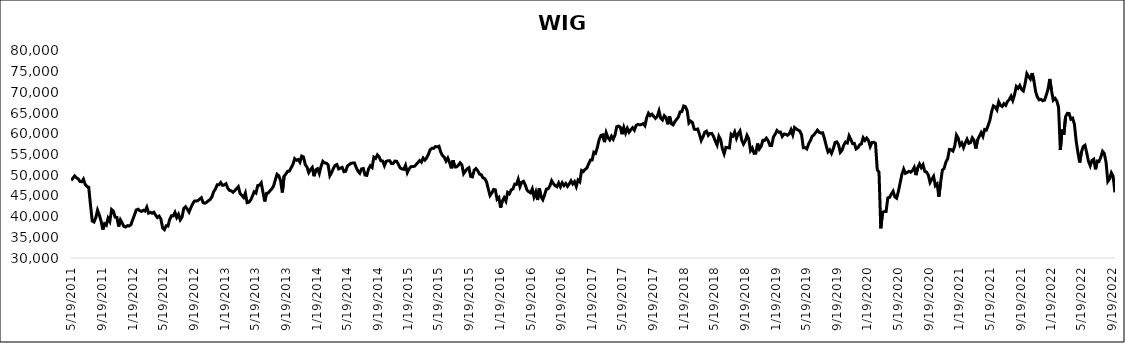
| Category | WIG |
|---|---|
| 5/19/11 | 48747.55 |
| 6/2/11 | 49824.93 |
| 6/9/11 | 49378.82 |
| 6/16/11 | 49129.21 |
| 6/23/11 | 48485.26 |
| 6/30/11 | 48414.36 |
| 7/7/11 | 49057.05 |
| 7/14/11 | 47768.38 |
| 7/21/11 | 47291.31 |
| 7/28/11 | 47071.4 |
| 8/4/11 | 42828.22 |
| 8/11/11 | 38934.71 |
| 8/18/11 | 38697.56 |
| 8/25/11 | 39715.27 |
| 9/1/11 | 41553.09 |
| 9/8/11 | 40405.17 |
| 9/15/11 | 38945 |
| 9/22/11 | 36851.2 |
| 9/29/11 | 38264.32 |
| 10/6/11 | 37915.03 |
| 10/13/11 | 39608.13 |
| 10/20/11 | 38835.92 |
| 10/27/11 | 41708.88 |
| 11/3/11 | 41313.92 |
| 11/10/11 | 39853.18 |
| 11/17/11 | 39797.19 |
| 11/24/11 | 37607.27 |
| 12/1/11 | 39215.21 |
| 12/8/11 | 38474.28 |
| 12/15/11 | 37637.47 |
| 12/22/11 | 37478.7 |
| 12/29/11 | 37814.52 |
| 1/5/12 | 37739.39 |
| 1/12/12 | 38062.87 |
| 1/19/12 | 39288.13 |
| 1/26/12 | 40392.48 |
| 2/2/12 | 41602.24 |
| 2/9/12 | 41792.46 |
| 2/16/12 | 41430.3 |
| 2/23/12 | 41258.14 |
| 3/1/12 | 41533.87 |
| 3/8/12 | 41337.97 |
| 3/15/12 | 42281.33 |
| 3/22/12 | 40834.43 |
| 3/29/12 | 41028.06 |
| 4/5/12 | 40802.41 |
| 4/12/12 | 41053.82 |
| 4/19/12 | 40354.53 |
| 4/26/12 | 39761.78 |
| 5/3/12 | 40114.73 |
| 5/10/12 | 39404.16 |
| 5/17/12 | 37228.88 |
| 5/24/12 | 36852.75 |
| 5/31/12 | 37793.58 |
| 6/7/12 | 37707.25 |
| 6/14/12 | 39286.64 |
| 6/21/12 | 40207.61 |
| 6/28/12 | 40165.34 |
| 7/5/12 | 41013.96 |
| 7/12/12 | 39778.1 |
| 7/19/12 | 40545.64 |
| 7/26/12 | 39213.05 |
| 8/2/12 | 39876.95 |
| 8/9/12 | 41976.63 |
| 8/16/12 | 42408.41 |
| 8/23/12 | 41795.63 |
| 8/30/12 | 41077.44 |
| 9/6/12 | 42134.93 |
| 9/13/12 | 43047.41 |
| 9/20/12 | 43737.02 |
| 9/27/12 | 43763.3 |
| 10/4/12 | 43840.23 |
| 10/11/12 | 44224.67 |
| 10/18/12 | 44550.12 |
| 10/25/12 | 43374.6 |
| 11/1/12 | 43232.44 |
| 11/8/12 | 43429.42 |
| 11/15/12 | 43845.94 |
| 11/22/12 | 44121.53 |
| 11/29/12 | 44787.84 |
| 12/6/12 | 46019.97 |
| 12/13/12 | 46653.84 |
| 12/20/12 | 47701.82 |
| 12/27/12 | 47673.03 |
| 1/3/13 | 48222.72 |
| 1/10/13 | 47546.91 |
| 1/17/13 | 47661.37 |
| 1/24/13 | 47942.04 |
| 1/31/13 | 46840.15 |
| 2/7/13 | 46329.66 |
| 2/14/13 | 46211.54 |
| 2/21/13 | 45879.9 |
| 2/28/13 | 46280.36 |
| 3/7/13 | 46745.26 |
| 3/14/13 | 47223.68 |
| 3/21/13 | 45580.47 |
| 3/28/13 | 45147.57 |
| 4/4/13 | 44623.89 |
| 4/11/13 | 45688.48 |
| 4/18/13 | 43364.7 |
| 4/25/13 | 43482.18 |
| 5/2/13 | 43991.51 |
| 5/9/13 | 44943.16 |
| 5/16/13 | 45992.03 |
| 5/23/13 | 45687.76 |
| 5/30/13 | 47476.64 |
| 6/6/13 | 47573.66 |
| 6/13/13 | 48152.82 |
| 6/20/13 | 45870 |
| 6/27/13 | 43667.37 |
| 7/4/13 | 45613.75 |
| 7/11/13 | 45712.72 |
| 7/18/13 | 46221.23 |
| 7/25/13 | 46713.02 |
| 8/1/13 | 47370.81 |
| 8/8/13 | 48862.88 |
| 8/15/13 | 50223.95 |
| 8/22/13 | 49846.48 |
| 8/29/13 | 48676.45 |
| 9/5/13 | 45830.66 |
| 9/12/13 | 49771.55 |
| 9/19/13 | 50300.53 |
| 9/26/13 | 50936.34 |
| 10/3/13 | 50982.03 |
| 10/10/13 | 51806.83 |
| 10/17/13 | 52573.59 |
| 10/24/13 | 53994.46 |
| 10/31/13 | 53607.86 |
| 11/7/13 | 53785.07 |
| 11/14/13 | 53127.16 |
| 11/21/13 | 54621.21 |
| 11/28/13 | 54420.19 |
| 12/5/13 | 52597.13 |
| 12/12/13 | 51947.96 |
| 12/19/13 | 50631.75 |
| 12/26/13 | 51362.3 |
| 1/2/14 | 51865.89 |
| 1/9/14 | 49753.03 |
| 1/16/14 | 51288.7 |
| 1/23/14 | 51569.21 |
| 1/30/14 | 50417.17 |
| 2/6/14 | 52138.87 |
| 2/13/14 | 53349.65 |
| 2/20/14 | 52967.02 |
| 2/27/14 | 52906.04 |
| 3/6/14 | 52487.84 |
| 3/13/14 | 49878.65 |
| 3/20/14 | 50627.71 |
| 3/27/14 | 51642.99 |
| 4/3/14 | 52376.18 |
| 4/10/14 | 52580.73 |
| 4/17/14 | 51510.98 |
| 4/24/14 | 51705.76 |
| 5/1/14 | 51892.77 |
| 5/8/14 | 50851.25 |
| 5/15/14 | 50944.5 |
| 5/22/14 | 52244.13 |
| 5/29/14 | 52553.48 |
| 6/5/14 | 52901.29 |
| 6/12/14 | 52927.91 |
| 6/19/14 | 52937.45 |
| 6/26/14 | 51815.43 |
| 7/3/14 | 50951.73 |
| 7/10/14 | 50474.36 |
| 7/17/14 | 51527.37 |
| 7/24/14 | 51613.47 |
| 7/31/14 | 50037.12 |
| 8/7/14 | 49958.67 |
| 8/14/14 | 51512.57 |
| 8/21/14 | 52294.93 |
| 8/28/14 | 51882.01 |
| 9/4/14 | 54358.49 |
| 9/11/14 | 54065.27 |
| 9/18/14 | 54906.1 |
| 9/25/14 | 54411.77 |
| 10/2/14 | 53498.77 |
| 10/9/14 | 53416.03 |
| 10/16/14 | 52297.79 |
| 10/23/14 | 53335.43 |
| 10/30/14 | 53492 |
| 11/6/14 | 53512.14 |
| 11/13/14 | 52816.35 |
| 11/20/14 | 52848.54 |
| 11/27/14 | 53415.63 |
| 12/4/14 | 53346.86 |
| 12/11/14 | 52550.03 |
| 12/18/14 | 51739.04 |
| 12/25/14 | 51511.68 |
| 1/1/15 | 51416.08 |
| 1/8/15 | 52391 |
| 1/15/15 | 50616.63 |
| 1/22/15 | 51484.81 |
| 1/29/15 | 52040.24 |
| 2/5/15 | 52107.26 |
| 2/12/15 | 52139.81 |
| 2/19/15 | 52572.95 |
| 2/26/15 | 53042.6 |
| 3/5/15 | 53546.4 |
| 3/12/15 | 53136.13 |
| 3/19/15 | 54148.48 |
| 3/26/15 | 53649.9 |
| 4/2/15 | 54179.04 |
| 4/9/15 | 55063.85 |
| 4/16/15 | 56165.1 |
| 4/23/15 | 56492.95 |
| 4/30/15 | 56477.69 |
| 5/7/15 | 56911.34 |
| 5/14/15 | 56845.83 |
| 5/21/15 | 56990.6 |
| 5/28/15 | 55556.13 |
| 6/4/15 | 54749.74 |
| 6/11/15 | 54357.69 |
| 6/18/15 | 53408.53 |
| 6/25/15 | 54141.2 |
| 7/2/15 | 53074.71 |
| 7/9/15 | 51658.71 |
| 7/16/15 | 53588.24 |
| 7/23/15 | 51986.22 |
| 7/30/15 | 52011.81 |
| 8/6/15 | 52418.07 |
| 8/13/15 | 52995.96 |
| 8/20/15 | 52508.32 |
| 8/27/15 | 50366.09 |
| 9/3/15 | 50977.06 |
| 9/10/15 | 51527.08 |
| 9/17/15 | 51801.58 |
| 9/24/15 | 49701.31 |
| 10/1/15 | 49593.95 |
| 10/8/15 | 51222.77 |
| 10/15/15 | 51599.62 |
| 10/22/15 | 51094.29 |
| 10/29/15 | 50262.68 |
| 11/5/15 | 50125.85 |
| 11/12/15 | 49358.2 |
| 11/19/15 | 49177.74 |
| 11/26/15 | 48418.14 |
| 12/3/15 | 46693.09 |
| 12/10/15 | 45093.65 |
| 12/17/15 | 45684.05 |
| 12/24/15 | 46564.08 |
| 12/31/15 | 46467.38 |
| 1/7/16 | 44195.91 |
| 1/14/16 | 44596.08 |
| 1/21/16 | 42180.3 |
| 1/28/16 | 43778.96 |
| 2/4/16 | 44557.64 |
| 2/11/16 | 43741.96 |
| 2/18/16 | 45834.88 |
| 2/25/16 | 45497.77 |
| 3/3/16 | 46448.27 |
| 3/10/16 | 46686.74 |
| 3/17/16 | 47833.39 |
| 3/24/16 | 47778.01 |
| 3/31/16 | 49017.35 |
| 4/7/16 | 47231.36 |
| 4/14/16 | 48285.21 |
| 4/21/16 | 48514.39 |
| 4/28/16 | 47643.7 |
| 5/5/16 | 46430.16 |
| 5/12/16 | 46022.02 |
| 5/19/16 | 45751.68 |
| 5/26/16 | 46695.37 |
| 6/2/16 | 44772.72 |
| 6/9/16 | 45940.12 |
| 6/16/16 | 44007.81 |
| 6/23/16 | 46826.85 |
| 6/30/16 | 44748.53 |
| 7/7/16 | 44077.16 |
| 7/14/16 | 45246.26 |
| 7/21/16 | 46639.17 |
| 7/28/16 | 46718.98 |
| 8/4/16 | 47407.09 |
| 8/11/16 | 48675.96 |
| 8/18/16 | 47967.07 |
| 8/25/16 | 47464.07 |
| 9/1/16 | 47221.32 |
| 9/8/16 | 48129.15 |
| 9/15/16 | 47198.39 |
| 9/22/16 | 48154.88 |
| 9/29/16 | 47494.62 |
| 10/6/16 | 48014.44 |
| 10/13/16 | 47303.15 |
| 10/20/16 | 47894.17 |
| 10/27/16 | 48651.28 |
| 11/3/16 | 47899.61 |
| 11/10/16 | 48447.59 |
| 11/17/16 | 47274.21 |
| 11/24/16 | 48824.83 |
| 12/1/16 | 48404.21 |
| 12/8/16 | 51123.43 |
| 12/15/16 | 50881.35 |
| 12/22/16 | 51423.71 |
| 12/29/16 | 51703.91 |
| 1/5/17 | 52721.67 |
| 1/12/17 | 53650.94 |
| 1/19/17 | 53654.99 |
| 1/26/17 | 55560.23 |
| 2/2/17 | 55303.11 |
| 2/9/17 | 56785.52 |
| 2/16/17 | 58610.28 |
| 2/23/17 | 59583.89 |
| 3/2/17 | 59743.64 |
| 3/9/17 | 57986.6 |
| 3/16/17 | 60247.18 |
| 3/23/17 | 59093.68 |
| 3/30/17 | 58527.2 |
| 4/6/17 | 59406.36 |
| 4/13/17 | 58695.36 |
| 4/20/17 | 59700.07 |
| 4/27/17 | 61731.8 |
| 5/4/17 | 61862.8 |
| 5/11/17 | 61598.78 |
| 5/18/17 | 59901.12 |
| 5/25/17 | 61536.22 |
| 6/1/17 | 60181.96 |
| 6/8/17 | 61312.68 |
| 6/15/17 | 60381.07 |
| 6/22/17 | 60987.33 |
| 6/29/17 | 61475.96 |
| 7/6/17 | 60869.83 |
| 7/13/17 | 62018.68 |
| 7/20/17 | 62269.72 |
| 7/27/17 | 62171.7 |
| 8/3/17 | 62231.08 |
| 8/10/17 | 62451.57 |
| 8/17/17 | 61949.4 |
| 8/24/17 | 63886.54 |
| 8/31/17 | 64973.76 |
| 9/7/17 | 64381.87 |
| 9/14/17 | 64748.47 |
| 9/21/17 | 64209.19 |
| 9/28/17 | 63729.77 |
| 10/5/17 | 64185.71 |
| 10/12/17 | 65529.1 |
| 10/19/17 | 63745 |
| 10/26/17 | 63342.71 |
| 11/2/17 | 64375.83 |
| 11/9/17 | 63923.62 |
| 11/16/17 | 62299.29 |
| 11/23/17 | 64207.77 |
| 11/30/17 | 62440.31 |
| 12/7/17 | 62164.65 |
| 12/14/17 | 62916.39 |
| 12/21/17 | 63477.25 |
| 12/28/17 | 64053.47 |
| 1/4/18 | 65297.96 |
| 1/11/18 | 65379.88 |
| 1/18/18 | 66709.12 |
| 1/25/18 | 66561.79 |
| 2/1/18 | 65585.79 |
| 2/8/18 | 62604.89 |
| 2/15/18 | 63078.16 |
| 2/22/18 | 62717.27 |
| 3/1/18 | 61116.96 |
| 3/8/18 | 61036.99 |
| 3/15/18 | 61156.91 |
| 3/22/18 | 59862.55 |
| 3/29/18 | 58377.42 |
| 4/5/18 | 59244.04 |
| 4/12/18 | 60393.23 |
| 4/19/18 | 60629.81 |
| 4/26/18 | 59628.04 |
| 5/3/18 | 60066.46 |
| 5/10/18 | 60091.26 |
| 5/17/18 | 59337.27 |
| 5/24/18 | 58189.49 |
| 5/31/18 | 57282.73 |
| 6/7/18 | 59412.76 |
| 6/14/18 | 58603.93 |
| 6/21/18 | 56425.25 |
| 6/28/18 | 55169.77 |
| 7/5/18 | 56719.88 |
| 7/12/18 | 56671.44 |
| 7/19/18 | 56585.5 |
| 7/26/18 | 59871.2 |
| 8/2/18 | 59484.35 |
| 8/9/18 | 60455.75 |
| 8/16/18 | 58921.44 |
| 8/23/18 | 60044.45 |
| 8/30/18 | 60690.32 |
| 9/6/18 | 58469.6 |
| 9/13/18 | 57493.38 |
| 9/20/18 | 58231.57 |
| 9/27/18 | 59616.27 |
| 10/4/18 | 58736.08 |
| 10/11/18 | 55941.06 |
| 10/18/18 | 56560.93 |
| 10/25/18 | 55271.63 |
| 11/1/18 | 55312.71 |
| 11/8/18 | 57655.73 |
| 11/15/18 | 56329.01 |
| 11/22/18 | 56932.62 |
| 11/29/18 | 58412.94 |
| 12/6/18 | 58409.09 |
| 12/13/18 | 58952.55 |
| 12/20/18 | 58349.03 |
| 12/27/18 | 57183.28 |
| 1/3/19 | 57192.42 |
| 1/10/19 | 59219.23 |
| 1/17/19 | 59894.9 |
| 1/24/19 | 60791.02 |
| 1/31/19 | 60367.42 |
| 2/7/19 | 60422.38 |
| 2/14/19 | 59348.4 |
| 2/21/19 | 59938.07 |
| 2/28/19 | 59903.7 |
| 3/7/19 | 59638.3 |
| 3/14/19 | 60002.72 |
| 3/21/19 | 60976.51 |
| 3/28/19 | 59752.66 |
| 4/4/19 | 61533.27 |
| 4/11/19 | 61168.92 |
| 4/18/19 | 60910.11 |
| 4/25/19 | 60680.62 |
| 5/2/19 | 59744.3 |
| 5/9/19 | 56637.25 |
| 5/16/19 | 56664.5 |
| 5/23/19 | 56351.13 |
| 5/30/19 | 57566.83 |
| 6/6/19 | 58360.5 |
| 6/13/19 | 59374.38 |
| 6/20/19 | 59738.56 |
| 6/27/19 | 60293.37 |
| 7/4/19 | 60888.98 |
| 7/11/19 | 60362.11 |
| 7/18/19 | 60192.6 |
| 7/25/19 | 60249.72 |
| 8/1/19 | 58863.73 |
| 8/8/19 | 57102.69 |
| 8/15/19 | 55634.7 |
| 8/22/19 | 56118.92 |
| 8/29/19 | 55273.05 |
| 9/5/19 | 56358.3 |
| 9/12/19 | 57886.6 |
| 9/19/19 | 58053.03 |
| 9/26/19 | 57377.87 |
| 10/3/19 | 55523.06 |
| 10/10/19 | 56034.97 |
| 10/17/19 | 57297.12 |
| 10/24/19 | 58012.97 |
| 10/31/19 | 57783.02 |
| 11/7/19 | 59492.22 |
| 11/14/19 | 58622.1 |
| 11/21/19 | 57618.54 |
| 11/28/19 | 57669.94 |
| 12/5/19 | 56338.75 |
| 12/12/19 | 56621.06 |
| 12/19/19 | 57346.95 |
| 12/26/19 | 57569.71 |
| 1/2/20 | 59048.28 |
| 1/9/20 | 58397.17 |
| 1/16/20 | 58962.37 |
| 1/23/20 | 58401.85 |
| 1/30/20 | 56923.36 |
| 2/6/20 | 57900.04 |
| 2/13/20 | 57960.23 |
| 2/20/20 | 57693.12 |
| 2/27/20 | 51318.69 |
| 3/5/20 | 50753.91 |
| 3/12/20 | 37164.02 |
| 3/19/20 | 41041.92 |
| 3/26/20 | 41202.98 |
| 4/2/20 | 41219.51 |
| 4/9/20 | 44499.23 |
| 4/16/20 | 44645.12 |
| 4/23/20 | 45450.43 |
| 4/30/20 | 46117 |
| 5/7/20 | 44769.05 |
| 5/14/20 | 44450.71 |
| 5/21/20 | 46073.39 |
| 5/28/20 | 48144.34 |
| 6/4/20 | 50202.54 |
| 6/11/20 | 51486.94 |
| 6/18/20 | 50445.13 |
| 6/25/20 | 50658.89 |
| 7/2/20 | 50937.18 |
| 7/9/20 | 50726.22 |
| 7/16/20 | 51121.23 |
| 7/23/20 | 51890.42 |
| 7/30/20 | 50024.63 |
| 8/6/20 | 51816.87 |
| 8/13/20 | 52706.25 |
| 8/20/20 | 51842.65 |
| 8/27/20 | 52528.67 |
| 9/3/20 | 50915.67 |
| 9/10/20 | 50757.07 |
| 9/17/20 | 50035.54 |
| 9/24/20 | 48241.11 |
| 10/1/20 | 49035.41 |
| 10/8/20 | 49727.34 |
| 10/15/20 | 47482 |
| 10/22/20 | 47910.38 |
| 10/29/20 | 44840.6 |
| 11/5/20 | 48295.31 |
| 11/12/20 | 51229.23 |
| 11/19/20 | 51651.4 |
| 11/26/20 | 53187.31 |
| 12/3/20 | 53967.82 |
| 12/10/20 | 56230.4 |
| 12/17/20 | 56176.07 |
| 12/24/20 | 55843.46 |
| 12/31/20 | 57025.84 |
| 1/7/21 | 59687.54 |
| 1/14/21 | 58945.17 |
| 1/21/21 | 57226.74 |
| 1/28/21 | 57797.95 |
| 2/4/21 | 56669.86 |
| 2/11/21 | 57790.5 |
| 2/18/21 | 58684.46 |
| 2/25/21 | 57706.4 |
| 3/4/21 | 57869.71 |
| 3/11/21 | 59028.6 |
| 3/18/21 | 58405.96 |
| 3/25/21 | 56448.66 |
| 4/1/21 | 58512.71 |
| 4/8/21 | 59435.58 |
| 4/15/21 | 60279.93 |
| 4/22/21 | 59376.35 |
| 4/29/21 | 61043.33 |
| 5/6/21 | 60898.92 |
| 5/13/21 | 62004.52 |
| 5/20/21 | 63262.41 |
| 5/27/21 | 65400.51 |
| 6/3/21 | 66757.97 |
| 6/10/21 | 66507.19 |
| 6/17/21 | 65806.48 |
| 6/24/21 | 67745.39 |
| 7/1/21 | 66836.25 |
| 7/8/21 | 66598.05 |
| 7/15/21 | 67292.59 |
| 7/22/21 | 66882.41 |
| 7/29/21 | 67833.05 |
| 8/5/21 | 68256.77 |
| 8/12/21 | 69076.8 |
| 8/19/21 | 68035.61 |
| 8/26/21 | 69454.99 |
| 9/2/21 | 71431.16 |
| 9/9/21 | 70980.21 |
| 9/16/21 | 71674.66 |
| 9/23/21 | 70725.53 |
| 9/30/21 | 70340.86 |
| 10/7/21 | 72124.89 |
| 10/14/21 | 74524.78 |
| 10/21/21 | 73818.53 |
| 10/28/21 | 73217 |
| 11/4/21 | 74659.51 |
| 11/11/21 | 72794.96 |
| 11/18/21 | 70145.47 |
| 11/25/21 | 68860.62 |
| 12/2/21 | 68203.86 |
| 12/9/21 | 68326.8 |
| 12/16/21 | 67984.08 |
| 12/23/21 | 68120.16 |
| 12/30/21 | 69296.26 |
| 1/6/22 | 70750.99 |
| 1/13/22 | 73245.28 |
| 1/20/22 | 70419.86 |
| 1/27/22 | 68131.21 |
| 2/3/22 | 68551 |
| 2/10/22 | 67939.86 |
| 2/17/22 | 66409.08 |
| 2/24/22 | 56086.65 |
| 3/3/22 | 61010.19 |
| 3/10/22 | 59796.72 |
| 3/17/22 | 64133.07 |
| 3/24/22 | 64948.68 |
| 3/31/22 | 64900.36 |
| 4/7/22 | 63524.54 |
| 4/14/22 | 63760.06 |
| 4/21/22 | 62331.7 |
| 4/28/22 | 58300.98 |
| 5/5/22 | 55467.4 |
| 5/12/22 | 53074.58 |
| 5/19/22 | 55555.31 |
| 5/26/22 | 56929.76 |
| 6/2/22 | 57227.34 |
| 6/9/22 | 55440.27 |
| 6/16/22 | 53357.34 |
| 6/23/22 | 52274.01 |
| 6/30/22 | 53573.42 |
| 7/7/22 | 53853.42 |
| 7/14/22 | 51418.11 |
| 7/21/22 | 53415.38 |
| 7/28/22 | 53324.51 |
| 8/4/22 | 54351.82 |
| 8/11/22 | 55774.95 |
| 8/18/22 | 55245.45 |
| 8/25/22 | 53074.42 |
| 9/1/22 | 48479.34 |
| 9/8/22 | 49104.24 |
| 9/15/22 | 50571.87 |
| 9/22/22 | 49765.47 |
| 9/29/22 | 45864.62 |